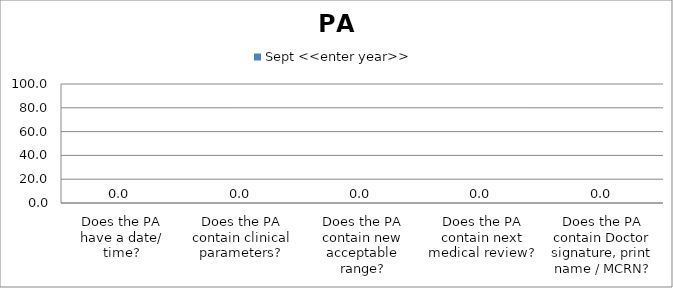
| Category | Sept <<enter year>> |
|---|---|
| Does the PA have a date/ time? | 0 |
| Does the PA contain clinical parameters? | 0 |
| Does the PA contain new acceptable range? | 0 |
| Does the PA contain next medical review? | 0 |
| Does the PA contain Doctor signature, print name / MCRN? | 0 |